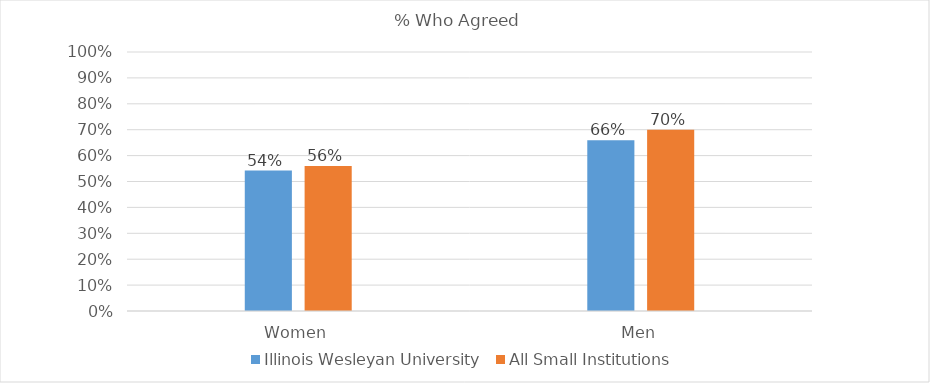
| Category | Illinois Wesleyan University | All Small Institutions |
|---|---|---|
| Women | 0.542 | 0.56 |
| Men | 0.659 | 0.7 |